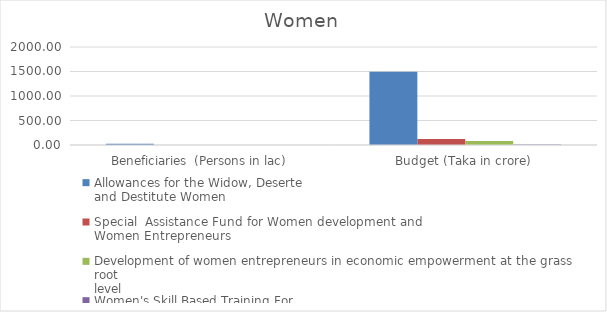
| Category | Allowances for the Widow, Deserte
and Destitute Women | Special  Assistance Fund for Women development and
Women Entrepreneurs | Development of women entrepreneurs in economic empowerment at the grass root
level | Women's Skill Based Training For
Livelihood |
|---|---|---|---|---|
| Beneficiaries  (Persons in lac) | 24.75 | 0.25 | 0.4 | 0.26 |
| Budget (Taka in crore) | 1495.4 | 125 | 79.29 | 7.99 |